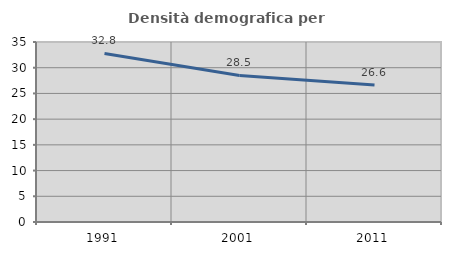
| Category | Densità demografica |
|---|---|
| 1991.0 | 32.768 |
| 2001.0 | 28.492 |
| 2011.0 | 26.629 |